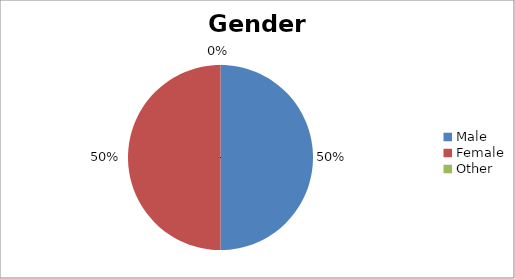
| Category | Gender |
|---|---|
| Male | 7 |
| Female | 7 |
| Other | 0 |